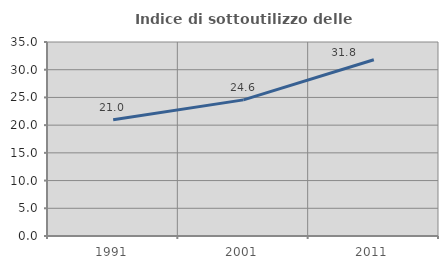
| Category | Indice di sottoutilizzo delle abitazioni  |
|---|---|
| 1991.0 | 20.955 |
| 2001.0 | 24.56 |
| 2011.0 | 31.804 |